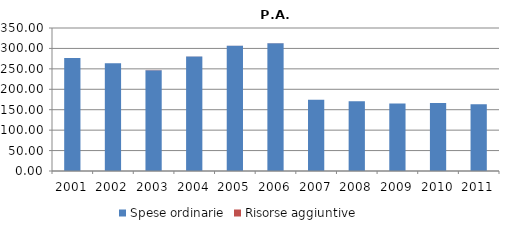
| Category | Spese ordinarie | Risorse aggiuntive |
|---|---|---|
| 2001 | 276.365 | 0 |
| 2002 | 263.868 | 0.033 |
| 2003 | 246.807 | 0.516 |
| 2004 | 280.232 | 0.194 |
| 2005 | 306.816 | 0.161 |
| 2006 | 312.579 | 0.219 |
| 2007 | 174.644 | 0.05 |
| 2008 | 170.767 | 0.035 |
| 2009 | 165.393 | 0 |
| 2010 | 166.592 | 0 |
| 2011 | 163.265 | 0 |